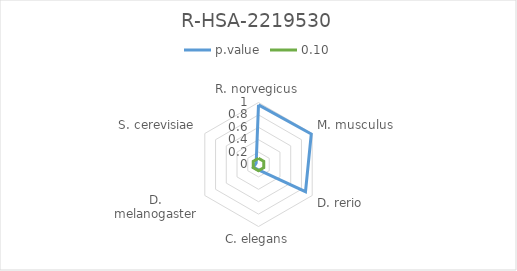
| Category | p.value | 0.10 |
|---|---|---|
| R. norvegicus | 0.962 | 0.1 |
| M. musculus | 0.983 | 0.1 |
| D. rerio | 0.875 | 0.1 |
| C. elegans | 0.087 | 0.1 |
| D. melanogaster | 0.095 | 0.1 |
| S. cerevisiae | 0.044 | 0.1 |